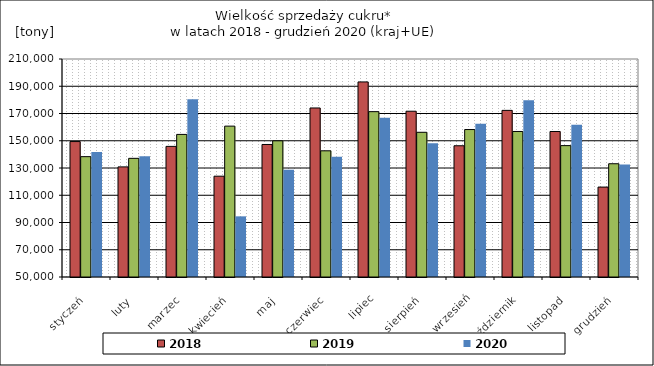
| Category | 2018 | 2019 | 2020 |
|---|---|---|---|
| styczeń | 149394.09 | 138330.31 | 141767.42 |
| luty | 130822.53 | 137095.49 | 138656.7 |
| marzec | 145863.79 | 154647.44 | 180503.53 |
| kwiecień | 123979.52 | 160722.77 | 94521.89 |
| maj | 147269.63 | 149962.12 | 128649.9 |
| czerwiec | 174058.88 | 142617.98 | 138269.79 |
| lipiec | 193169.88 | 171364.62 | 166919 |
| sierpień | 171663.7 | 156211.56 | 148210.3 |
| wrzesień | 146323.5 | 158226.28 | 162524.88 |
| październik | 172295.67 | 156804.33 | 179757.04 |
| listopad | 156790.45 | 146432.58 | 161724.7 |
| grudzień | 115997.05 | 133122.03 | 132594.64 |